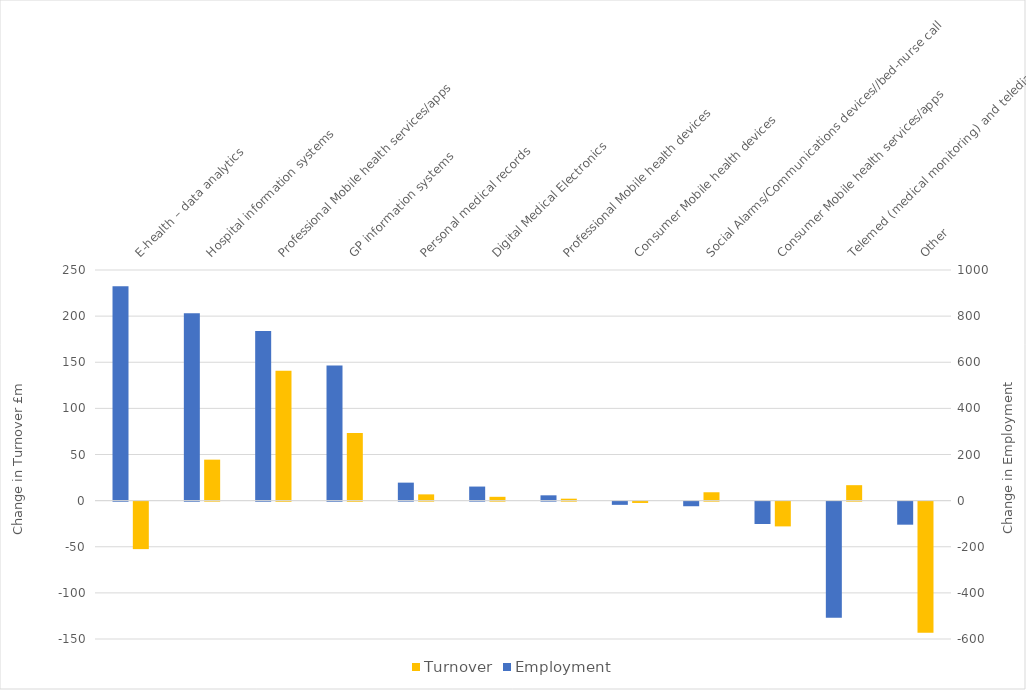
| Category | Series 1 | Turnover |
|---|---|---|
|  E-health – data analytics  |  | -51.484 |
|  Hospital information systems   |  | 44.417 |
|  Professional Mobile health services/apps  |  | 140.897 |
|  GP information systems  |  | 73.286 |
|  Personal medical records  |  | 6.775 |
|  Digital Medical Electronics   |  | 4.134 |
|  Professional Mobile health devices  |  | 2.1 |
|  Consumer Mobile health devices  |  | -1.441 |
|  Social Alarms/Communications devices//bed-nurse call  |  | 9.073 |
|  Consumer Mobile health services/apps  |  | -26.851 |
|  Telemed (medical monitoring) and telediag   |  | 16.751 |
|  Other  |  | -142.2 |